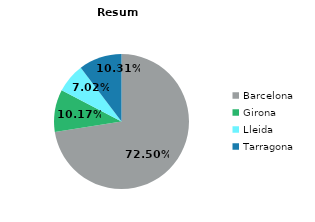
| Category | Mes actual |
|---|---|
| Barcelona | 4634 |
| Girona | 650 |
| Lleida | 449 |
| Tarragona | 659 |